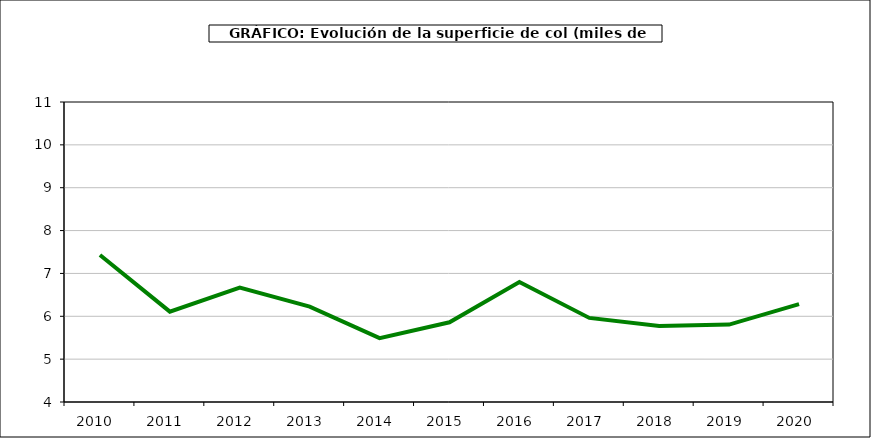
| Category | superficie |
|---|---|
| 2010.0 | 7.43 |
| 2011.0 | 6.108 |
| 2012.0 | 6.669 |
| 2013.0 | 6.224 |
| 2014.0 | 5.489 |
| 2015.0 | 5.861 |
| 2016.0 | 6.799 |
| 2017.0 | 5.962 |
| 2018.0 | 5.774 |
| 2019.0 | 5.806 |
| 2020.0 | 6.282 |